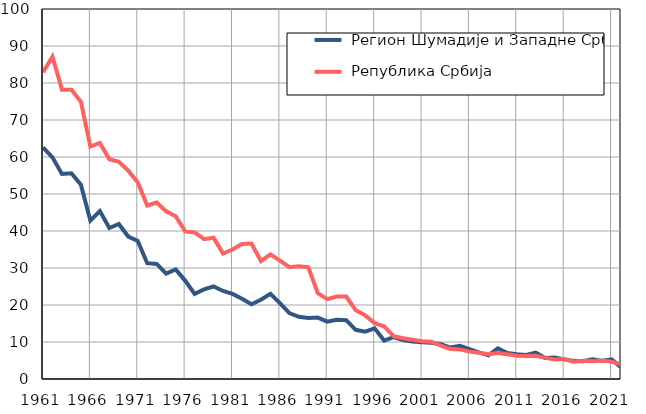
| Category |  Регион Шумадије и Западне Србије |  Република Србија |
|---|---|---|
| 1961.0 | 62.6 | 82.9 |
| 1962.0 | 59.9 | 87.1 |
| 1963.0 | 55.4 | 78.2 |
| 1964.0 | 55.6 | 78.2 |
| 1965.0 | 52.5 | 74.9 |
| 1966.0 | 42.8 | 62.8 |
| 1967.0 | 45.4 | 63.8 |
| 1968.0 | 40.8 | 59.4 |
| 1969.0 | 41.9 | 58.7 |
| 1970.0 | 38.5 | 56.3 |
| 1971.0 | 37.3 | 53.1 |
| 1972.0 | 31.3 | 46.9 |
| 1973.0 | 31.1 | 47.7 |
| 1974.0 | 28.5 | 45.3 |
| 1975.0 | 29.6 | 44 |
| 1976.0 | 26.6 | 39.9 |
| 1977.0 | 23 | 39.6 |
| 1978.0 | 24.2 | 37.8 |
| 1979.0 | 25 | 38.2 |
| 1980.0 | 23.8 | 33.9 |
| 1981.0 | 23 | 35 |
| 1982.0 | 21.7 | 36.5 |
| 1983.0 | 20.2 | 36.6 |
| 1984.0 | 21.4 | 31.9 |
| 1985.0 | 23 | 33.7 |
| 1986.0 | 20.5 | 32 |
| 1987.0 | 17.8 | 30.2 |
| 1988.0 | 16.8 | 30.5 |
| 1989.0 | 16.5 | 30.2 |
| 1990.0 | 16.6 | 23.2 |
| 1991.0 | 15.5 | 21.6 |
| 1992.0 | 16 | 22.3 |
| 1993.0 | 15.9 | 22.3 |
| 1994.0 | 13.3 | 18.6 |
| 1995.0 | 12.8 | 17.2 |
| 1996.0 | 13.7 | 15.1 |
| 1997.0 | 10.4 | 14.2 |
| 1998.0 | 11.3 | 11.6 |
| 1999.0 | 10.5 | 11 |
| 2000.0 | 10.1 | 10.6 |
| 2001.0 | 9.9 | 10.2 |
| 2002.0 | 9.8 | 10.1 |
| 2003.0 | 9.4 | 9 |
| 2004.0 | 8.5 | 8.1 |
| 2005.0 | 9 | 8 |
| 2006.0 | 8.1 | 7.4 |
| 2007.0 | 7.2 | 7.1 |
| 2008.0 | 6.4 | 6.7 |
| 2009.0 | 8.3 | 7 |
| 2010.0 | 7 | 6.7 |
| 2011.0 | 6.7 | 6.3 |
| 2012.0 | 6.5 | 6.2 |
| 2013.0 | 7.1 | 6.3 |
| 2014.0 | 5.7 | 5.7 |
| 2015.0 | 5.8 | 5.3 |
| 2016.0 | 5.3 | 5.4 |
| 2017.0 | 4.9 | 4.7 |
| 2018.0 | 4.8 | 4.9 |
| 2019.0 | 5.3 | 4.8 |
| 2020.0 | 4.9 | 5 |
| 2021.0 | 5.3 | 4.7 |
| 2022.0 | 3.2 | 4 |